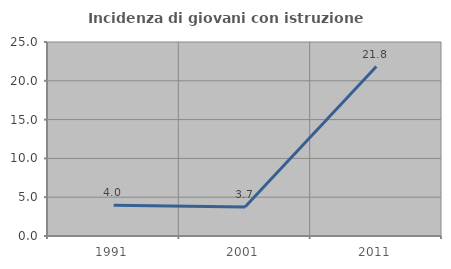
| Category | Incidenza di giovani con istruzione universitaria |
|---|---|
| 1991.0 | 3.968 |
| 2001.0 | 3.738 |
| 2011.0 | 21.839 |